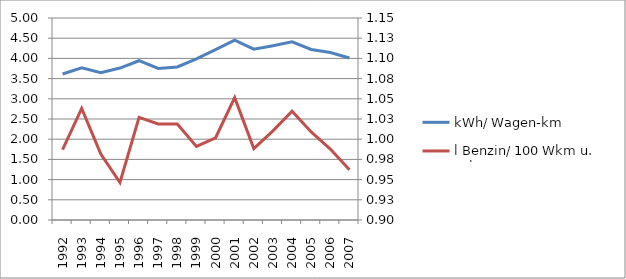
| Category | kWh/ Wagen-km |
|---|---|
| 1992.0 | 3.614 |
| 1993.0 | 3.768 |
| 1994.0 | 3.647 |
| 1995.0 | 3.761 |
| 1996.0 | 3.942 |
| 1997.0 | 3.753 |
| 1998.0 | 3.788 |
| 1999.0 | 3.99 |
| 2000.0 | 4.216 |
| 2001.0 | 4.451 |
| 2002.0 | 4.23 |
| 2003.0 | 4.316 |
| 2004.0 | 4.409 |
| 2005.0 | 4.222 |
| 2006.0 | 4.146 |
| 2007.0 | 4.011 |